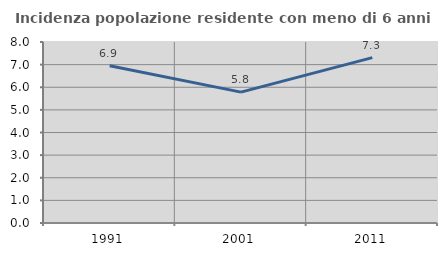
| Category | Incidenza popolazione residente con meno di 6 anni |
|---|---|
| 1991.0 | 6.95 |
| 2001.0 | 5.784 |
| 2011.0 | 7.309 |